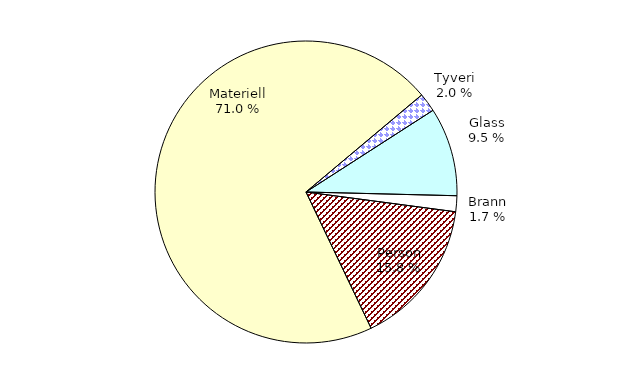
| Category | Series 0 |
|---|---|
| Tyveri | 68.855 |
| Glass | 324.465 |
| Brann | 58.15 |
| Person | 540.47 |
| Materiell | 2426.749 |